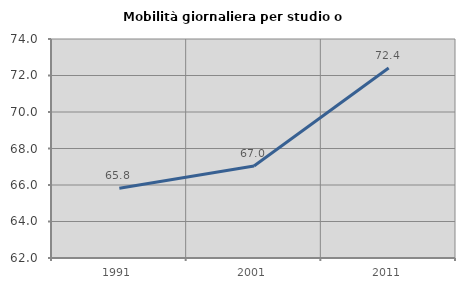
| Category | Mobilità giornaliera per studio o lavoro |
|---|---|
| 1991.0 | 65.817 |
| 2001.0 | 67.044 |
| 2011.0 | 72.415 |